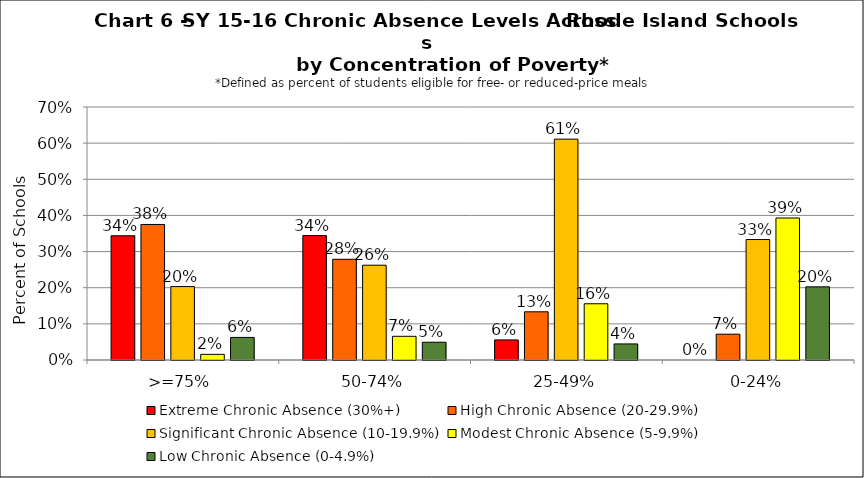
| Category | Extreme Chronic Absence (30%+) | High Chronic Absence (20-29.9%) | Significant Chronic Absence (10-19.9%) | Modest Chronic Absence (5-9.9%) | Low Chronic Absence (0-4.9%) |
|---|---|---|---|---|---|
| 0 | 0.344 | 0.375 | 0.203 | 0.016 | 0.062 |
| 1 | 0.344 | 0.279 | 0.262 | 0.066 | 0.049 |
| 2 | 0.056 | 0.133 | 0.611 | 0.156 | 0.044 |
| 3 | 0 | 0.071 | 0.333 | 0.393 | 0.202 |